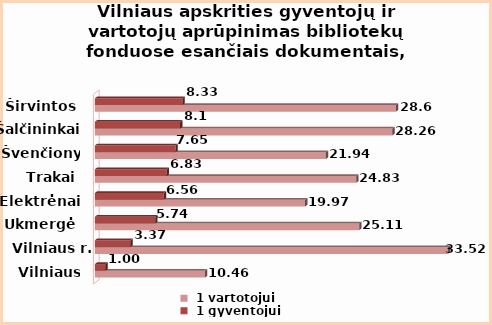
| Category | Series 0 | Series 1 |
|---|---|---|
| Vilniaus m. | 10.46 | 1 |
| Vilniaus r. | 33.52 | 3.37 |
| Ukmergė | 25.11 | 5.74 |
| Elektrėnai | 19.97 | 6.56 |
| Trakai | 24.83 | 6.83 |
| Švenčionys | 21.94 | 7.65 |
| Šalčininkai | 28.26 | 8.1 |
| Širvintos | 28.6 | 8.33 |